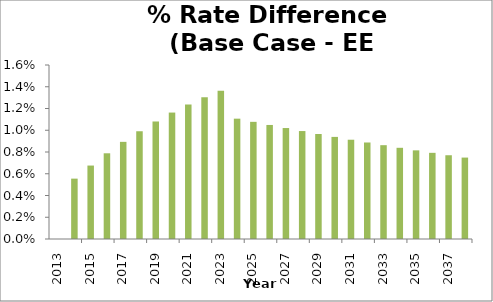
| Category | Series 0 |
|---|---|
| 2013.0 | 0 |
| 2014.0 | 0.006 |
| 2015.0 | 0.007 |
| 2016.0 | 0.008 |
| 2017.0 | 0.009 |
| 2018.0 | 0.01 |
| 2019.0 | 0.011 |
| 2020.0 | 0.012 |
| 2021.0 | 0.012 |
| 2022.0 | 0.013 |
| 2023.0 | 0.014 |
| 2024.0 | 0.011 |
| 2025.0 | 0.011 |
| 2026.0 | 0.01 |
| 2027.0 | 0.01 |
| 2028.0 | 0.01 |
| 2029.0 | 0.01 |
| 2030.0 | 0.009 |
| 2031.0 | 0.009 |
| 2032.0 | 0.009 |
| 2033.0 | 0.009 |
| 2034.0 | 0.008 |
| 2035.0 | 0.008 |
| 2036.0 | 0.008 |
| 2037.0 | 0.008 |
| 2038.0 | 0.007 |